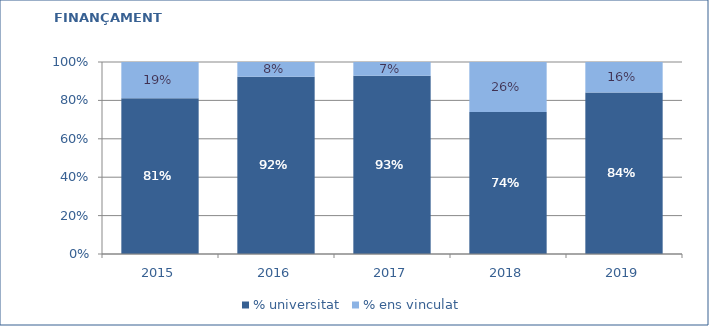
| Category | % universitat | % ens vinculat |
|---|---|---|
| 2015.0 | 0.811 | 0.189 |
| 2016.0 | 0.923 | 0.077 |
| 2017.0 | 0.928 | 0.072 |
| 2018.0 | 0.739 | 0.261 |
| 2019.0 | 0.841 | 0.159 |